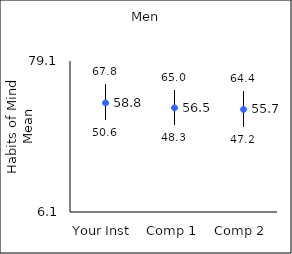
| Category | 25th percentile | 75th percentile | Mean |
|---|---|---|---|
| Your Inst | 50.6 | 67.8 | 58.82 |
| Comp 1 | 48.3 | 65 | 56.47 |
| Comp 2 | 47.2 | 64.4 | 55.67 |